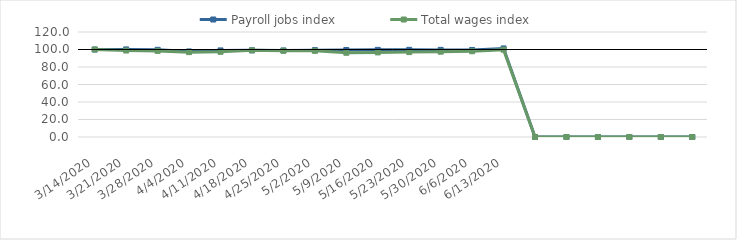
| Category | Payroll jobs index | Total wages index |
|---|---|---|
| 14/03/2020 | 100 | 100 |
| 21/03/2020 | 100.087 | 98.819 |
| 28/03/2020 | 99.659 | 98.417 |
| 04/04/2020 | 97.77 | 96.993 |
| 11/04/2020 | 98.931 | 97.387 |
| 18/04/2020 | 99.083 | 99.022 |
| 25/04/2020 | 98.902 | 98.605 |
| 02/05/2020 | 99.284 | 98.44 |
| 09/05/2020 | 99.44 | 96.252 |
| 16/05/2020 | 99.578 | 96.667 |
| 23/05/2020 | 99.619 | 97.026 |
| 30/05/2020 | 99.566 | 97.493 |
| 06/06/2020 | 99.465 | 98.009 |
| 13/06/2020 | 101.22 | 99.852 |